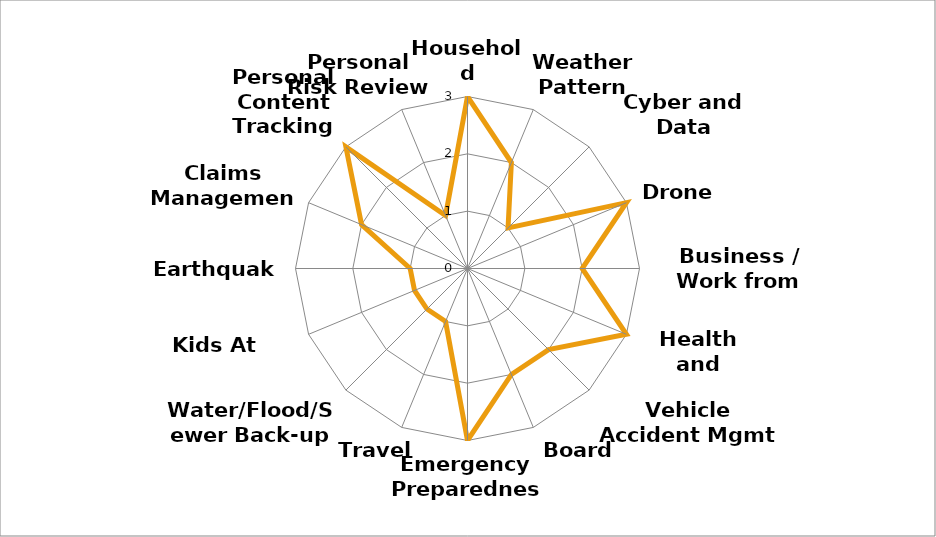
| Category | Series 0 |
|---|---|
| Household Workers | 3 |
| Weather Pattern Changes  | 2 |
| Cyber and Data Protection | 1 |
| Drones | 3 |
| Business / Work from Home | 2 |
| Health and Wellness | 3 |
| Vehicle Accident Mgmt | 2 |
| Board Member | 2 |
| Emergency Preparedness | 3 |
| Travel  | 1 |
| Water/Flood/Sewer Back-up | 1 |
| Kids At School  | 1 |
| Earthquake  | 1 |
| Claims Management | 2 |
| Personal Content Tracking  | 3 |
| Personal Risk Review | 1 |